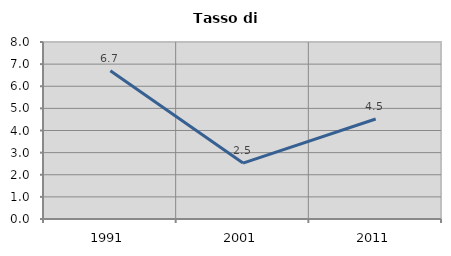
| Category | Tasso di disoccupazione   |
|---|---|
| 1991.0 | 6.699 |
| 2001.0 | 2.528 |
| 2011.0 | 4.519 |